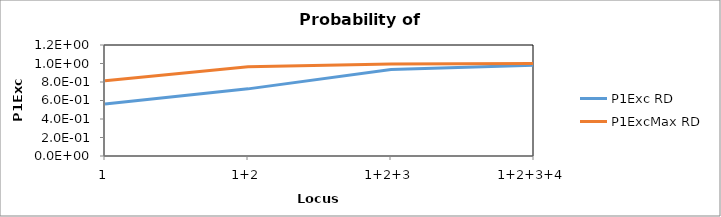
| Category | P1Exc RD | P1ExcMax RD |
|---|---|---|
| 1 | 0.563 | 0.813 |
| 1+2 | 0.726 | 0.965 |
| 1+2+3 | 0.934 | 0.995 |
| 1+2+3+4 | 0.982 | 0.999 |